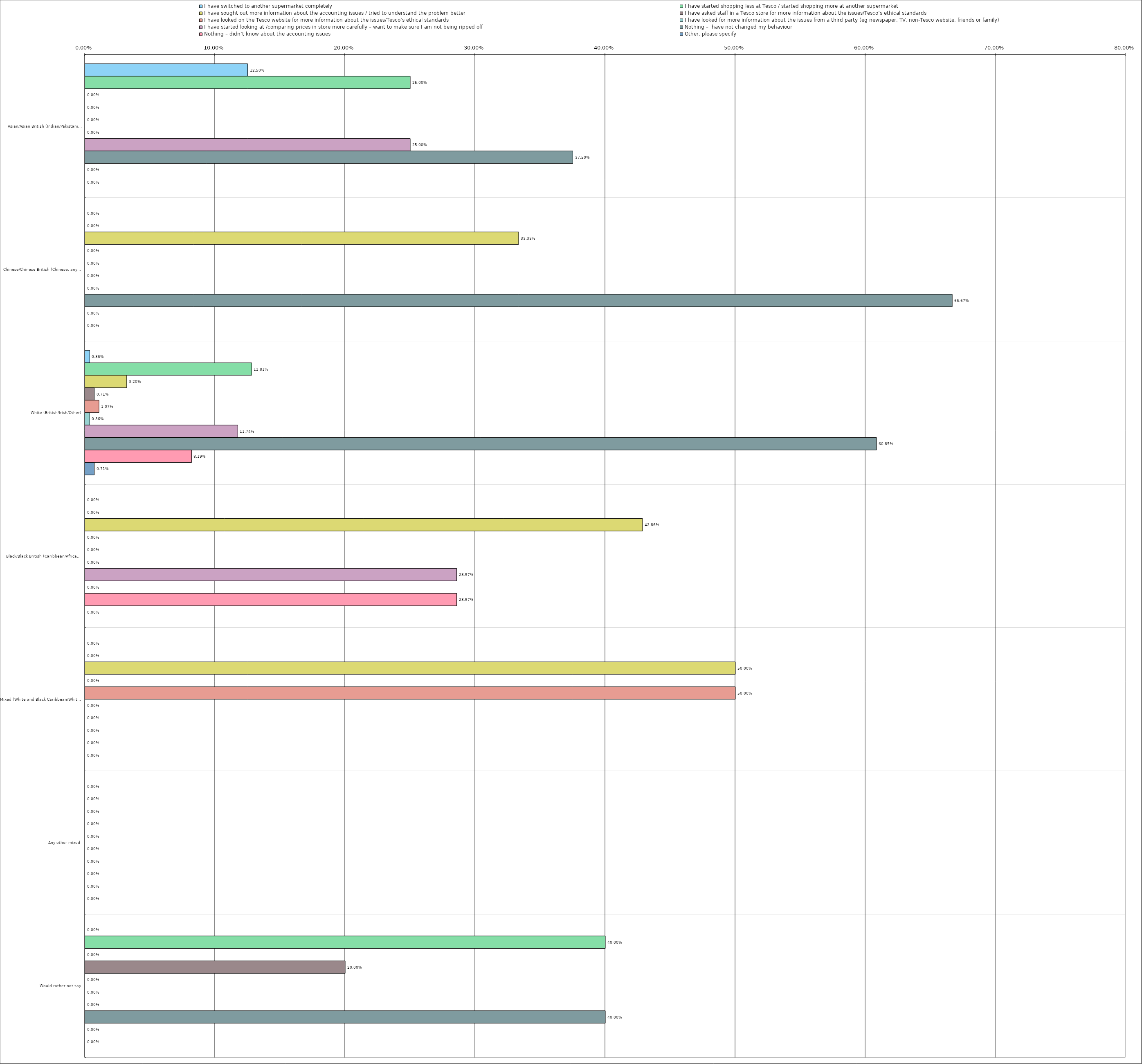
| Category | I have switched to another supermarket completely | I have started shopping less at Tesco / started shopping more at another supermarket | I have sought out more information about the accounting issues / tried to understand the problem better | I have asked staff in a Tesco store for more information about the issues/Tesco’s ethical standards | I have looked on the Tesco website for more information about the issues/Tesco’s ethical standards | I have looked for more information about the issues from a third party (eg newspaper, TV, non-Tesco website, friends or family) | I have started looking at /comparing prices in store more carefully – want to make sure I am not being ripped off | Nothing –  have not changed my behaviour | Nothing – didn’t know about the accounting issues | Other, please specify |
|---|---|---|---|---|---|---|---|---|---|---|
| 0 | 0.125 | 0.25 | 0 | 0 | 0 | 0 | 0.25 | 0.375 | 0 | 0 |
| 1 | 0 | 0 | 0.333 | 0 | 0 | 0 | 0 | 0.667 | 0 | 0 |
| 2 | 0.004 | 0.128 | 0.032 | 0.007 | 0.011 | 0.004 | 0.117 | 0.608 | 0.082 | 0.007 |
| 3 | 0 | 0 | 0.429 | 0 | 0 | 0 | 0.286 | 0 | 0.286 | 0 |
| 4 | 0 | 0 | 0.5 | 0 | 0.5 | 0 | 0 | 0 | 0 | 0 |
| 5 | 0 | 0 | 0 | 0 | 0 | 0 | 0 | 0 | 0 | 0 |
| 6 | 0 | 0.4 | 0 | 0.2 | 0 | 0 | 0 | 0.4 | 0 | 0 |